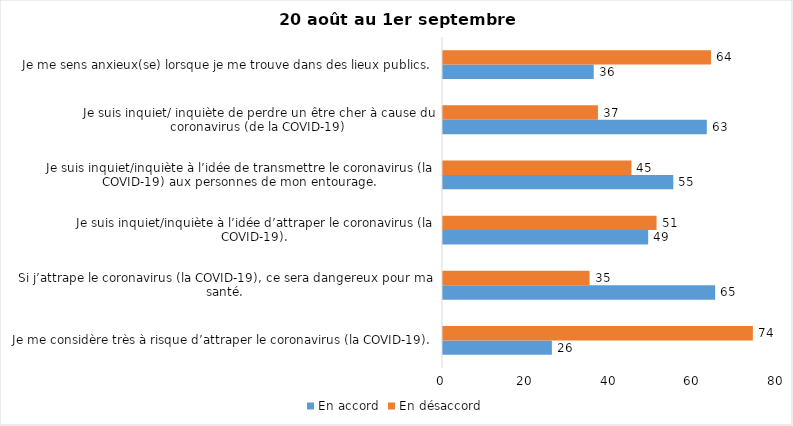
| Category | En accord | En désaccord |
|---|---|---|
| Je me considère très à risque d’attraper le coronavirus (la COVID-19). | 26 | 74 |
| Si j’attrape le coronavirus (la COVID-19), ce sera dangereux pour ma santé. | 65 | 35 |
| Je suis inquiet/inquiète à l’idée d’attraper le coronavirus (la COVID-19). | 49 | 51 |
| Je suis inquiet/inquiète à l’idée de transmettre le coronavirus (la COVID-19) aux personnes de mon entourage. | 55 | 45 |
| Je suis inquiet/ inquiète de perdre un être cher à cause du coronavirus (de la COVID-19) | 63 | 37 |
| Je me sens anxieux(se) lorsque je me trouve dans des lieux publics. | 36 | 64 |